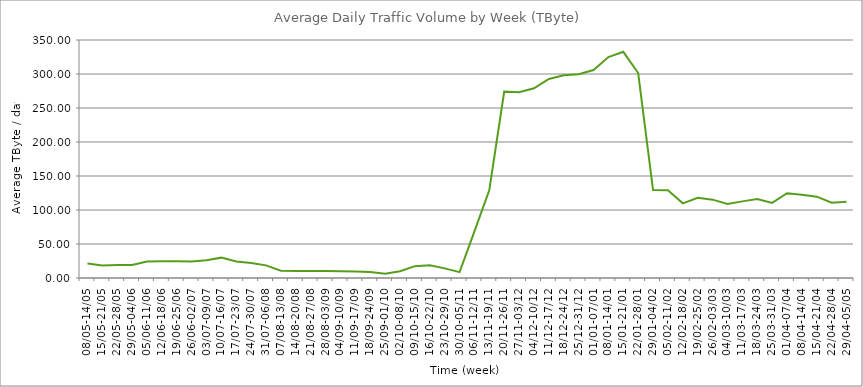
| Category | Average |
|---|---|
| 08/05-14/05 | 21.3 |
| 15/05-21/05 | 18.56 |
| 22/05-28/05 | 19.13 |
| 29/05-04/06 | 19 |
| 05/06-11/06 | 24.1 |
| 12/06-18/06 | 24.74 |
| 19/06-25/06 | 24.45 |
| 26/06-02/07 | 24.35 |
| 03/07-09/07 | 26.01 |
| 10/07-16/07 | 29.93 |
| 17/07-23/07 | 24.25 |
| 24/07-30/07 | 22.11 |
| 31/07-06/08 | 18.56 |
| 07/08-13/08 | 10.75 |
| 14/08-20/08 | 10.45 |
| 21/08-27/08 | 10.16 |
| 28/08-03/09 | 10.38 |
| 04/09-10/09 | 9.89 |
| 11/09-17/09 | 9.51 |
| 18/09-24/09 | 8.75 |
| 25/09-01/10 | 6.35 |
| 02/10-08/10 | 9.95 |
| 09/10-15/10 | 17.44 |
| 16/10-22/10 | 18.79 |
| 23/10-29/10 | 14.16 |
| 30/10-05/11 | 8.57 |
| 06/11-12/11 | 68.62 |
| 13/11-19/11 | 129.39 |
| 20/11-26/11 | 274.22 |
| 27/11-03/12 | 273.24 |
| 04/12-10/12 | 279.07 |
| 11/12-17/12 | 292.73 |
| 18/12-24/12 | 298.28 |
| 25/12-31/12 | 299.67 |
| 01/01-07/01 | 305.79 |
| 08/01-14/01 | 324.87 |
| 15/01-21/01 | 332.64 |
| 22/01-28/01 | 301.4 |
| 29/01-04/02 | 129.39 |
| 05/02-11/02 | 128.92 |
| 12/02-18/02 | 109.81 |
| 19/02-25/02 | 118.01 |
| 26/02-03/03 | 115.2 |
| 04/03-10/03 | 108.77 |
| 11/03-17/03 | 112.7 |
| 18/03-24/03 | 116.29 |
| 25/03-31/03 | 110.41 |
| 01/04-07/04 | 124.65 |
| 08/04-14/04 | 122.46 |
| 15/04-21/04 | 119.65 |
| 22/04-28/04 | 110.7 |
| 29/04-05/05 | 112.12 |